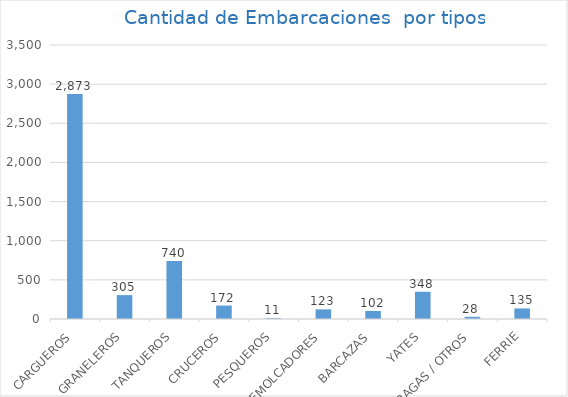
| Category | Series 0 |
|---|---|
| CARGUEROS | 2873 |
| GRANELEROS | 305 |
| TANQUEROS | 740 |
| CRUCEROS | 172 |
| PESQUEROS | 11 |
| REMOLCADORES | 123 |
| BARCAZAS | 102 |
| YATES | 348 |
| DRAGAS / OTROS | 28 |
| FERRIE | 135 |